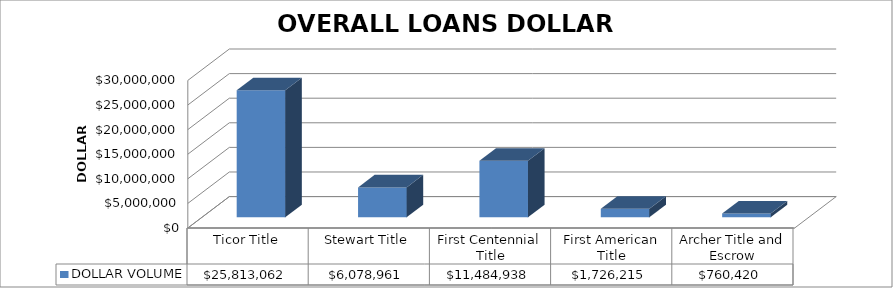
| Category | DOLLAR VOLUME |
|---|---|
| Ticor Title | 25813062 |
| Stewart Title | 6078961 |
| First Centennial Title | 11484937.7 |
| First American Title | 1726215 |
| Archer Title and Escrow | 760420 |